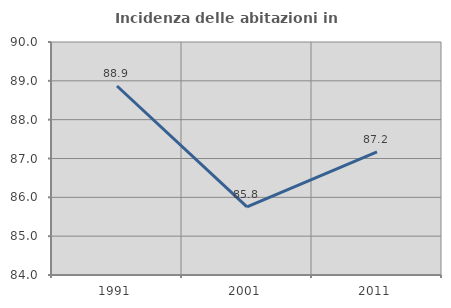
| Category | Incidenza delle abitazioni in proprietà  |
|---|---|
| 1991.0 | 88.868 |
| 2001.0 | 85.752 |
| 2011.0 | 87.168 |